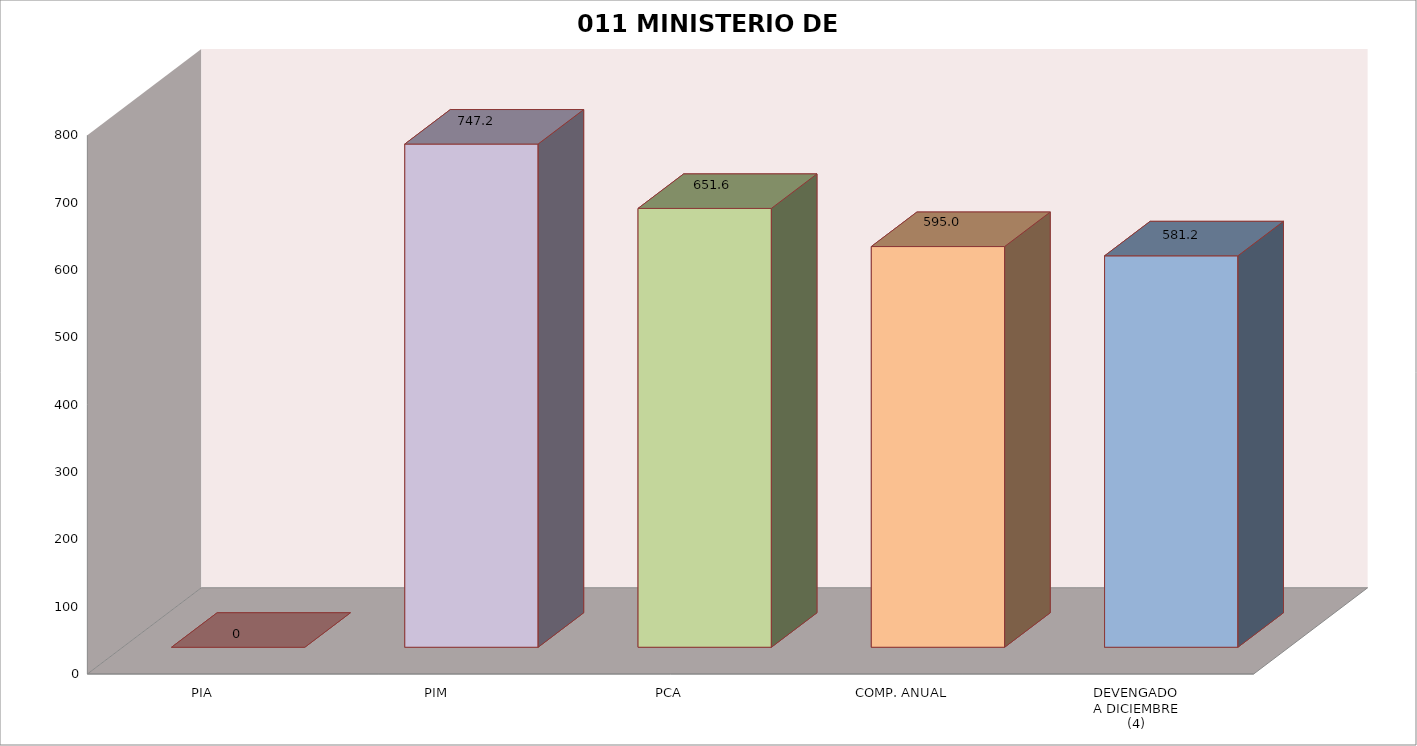
| Category | 011 MINISTERIO DE SALUD |
|---|---|
| PIA | 0 |
| PIM | 747.214 |
| PCA | 651.635 |
| COMP. ANUAL | 595.021 |
| DEVENGADO
A DICIEMBRE
(4) | 581.243 |